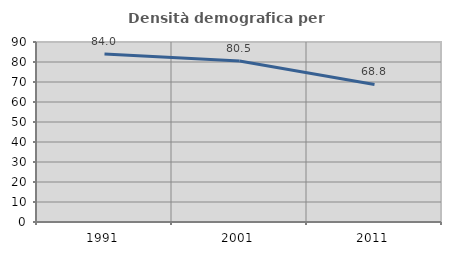
| Category | Densità demografica |
|---|---|
| 1991.0 | 84.009 |
| 2001.0 | 80.533 |
| 2011.0 | 68.78 |